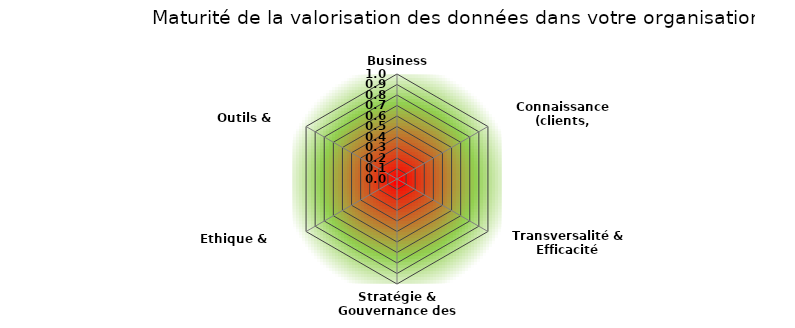
| Category | Series 0 |
|---|---|
| Business Models | 0 |
| Connaissance (clients, écosystème) | 0 |
| Transversalité & Efficacité opérationnelle | 0 |
| Stratégie & Gouvernance des données | 0 |
| Ethique & Conformité | 0 |
| Outils & Solutions | 0 |